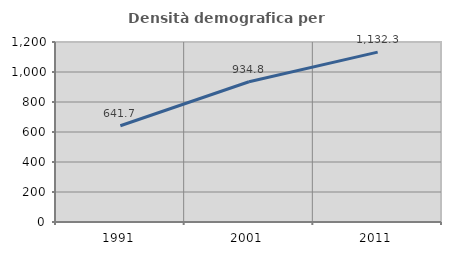
| Category | Densità demografica |
|---|---|
| 1991.0 | 641.721 |
| 2001.0 | 934.76 |
| 2011.0 | 1132.298 |